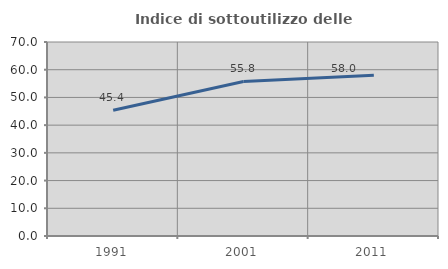
| Category | Indice di sottoutilizzo delle abitazioni  |
|---|---|
| 1991.0 | 45.37 |
| 2001.0 | 55.752 |
| 2011.0 | 58.013 |